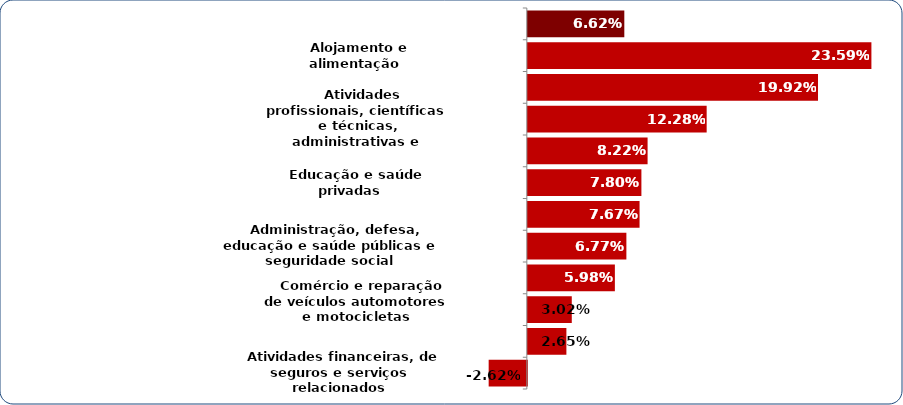
| Category | Series 0 |
|---|---|
|   Atividades financeiras, de seguros e serviços relacionados | -0.026 |
|   Atividades imobiliárias | 0.026 |
|   Comércio e reparação de veículos automotores e motocicletas | 0.03 |
|   Transporte, armazenagem e correio | 0.06 |
|   Administração, defesa, educação e saúde públicas e seguridade social | 0.068 |
|   Artes, cultura, esporte e recreação e outras atividades de serviços | 0.077 |
|   Educação e saúde privadas | 0.078 |
|   Informação e comunicação | 0.082 |
|   Atividades profissionais, científicas e técnicas, administrativas e serviços complementares | 0.123 |
|   Serviços domésticos | 0.199 |
|   Alojamento e alimentação | 0.236 |
|   SETOR SERVIÇOS | 0.066 |